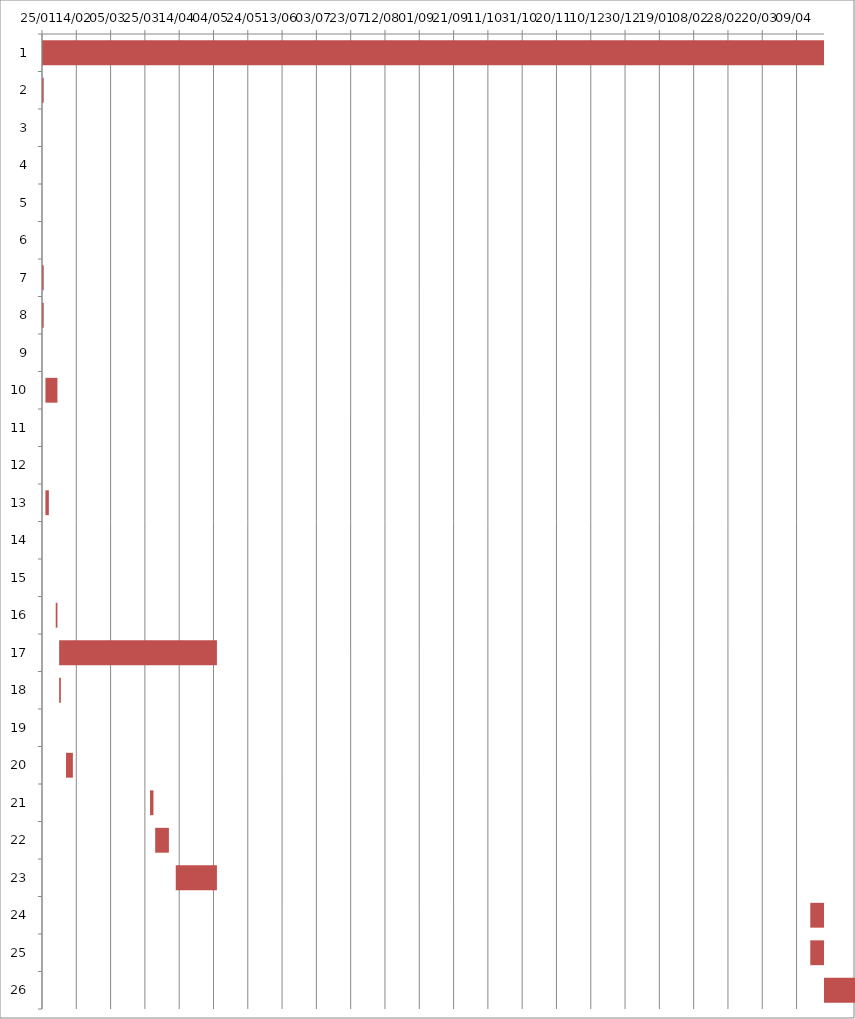
| Category | Fecha de inicio | DURACIÓN |
|---|---|---|
| 0 | 1/25/16 | 613 |
| 1 | 1/25/16 | 1 |
| 2 | 1/25/16 | 0 |
| 3 | 1/25/16 | 0 |
| 4 | 1/25/16 | 0 |
| 5 | 1/25/16 | 0 |
| 6 | 1/25/16 | 1 |
| 7 | 1/25/16 | 1 |
| 8 | 1/26/16 | 0 |
| 9 | 1/27/16 | 7 |
| 10 | 1/27/16 | 0 |
| 11 | 1/28/16 | 0 |
| 12 | 1/27/16 | 2 |
| 13 | 2/1/16 | 0 |
| 14 | 2/2/16 | 0 |
| 15 | 2/2/16 | 1 |
| 16 | 2/4/16 | 92 |
| 17 | 2/4/16 | 1 |
| 18 | 2/5/16 | 0 |
| 19 | 2/8/16 | 4 |
| 20 | 3/28/16 | 2 |
| 21 | 3/31/16 | 8 |
| 22 | 4/12/16 | 24 |
| 23 | 4/17/17 | 165 |
| 24 | 4/17/17 | 165 |
| 25 | 7/3/17 | 4 |